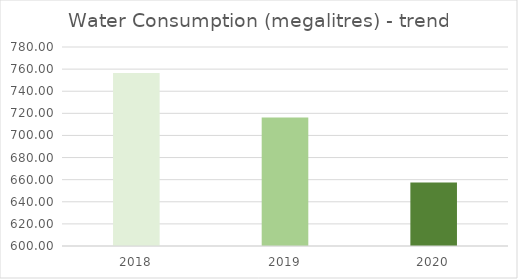
| Category | Series 0 |
|---|---|
| 0 | 756.42 |
| 1 | 716.16 |
| 2 | 657.37 |